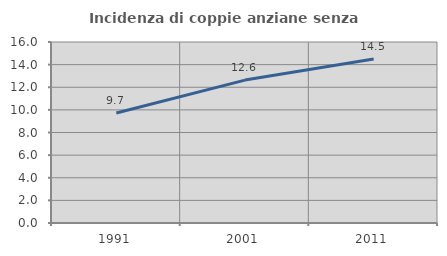
| Category | Incidenza di coppie anziane senza figli  |
|---|---|
| 1991.0 | 9.726 |
| 2001.0 | 12.634 |
| 2011.0 | 14.504 |